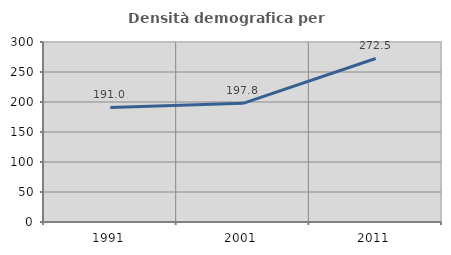
| Category | Densità demografica |
|---|---|
| 1991.0 | 190.994 |
| 2001.0 | 197.835 |
| 2011.0 | 272.528 |